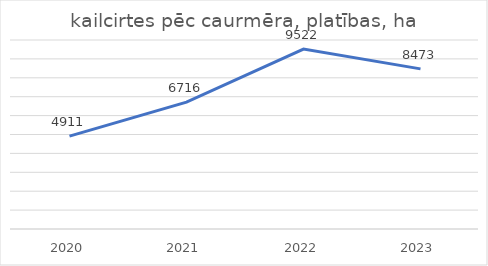
| Category | kailcirtes pēc caurmēra, platības, ha |
|---|---|
| 2020.0 | 4911 |
| 2021.0 | 6716 |
| 2022.0 | 9522 |
| 2023.0 | 8473 |